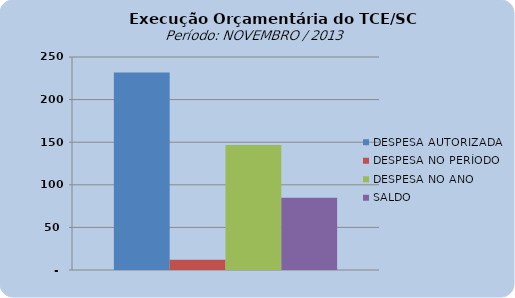
| Category | DESPESA AUTORIZADA | DESPESA NO PERÍODO | DESPESA NO ANO | SALDO |
|---|---|---|---|---|
| 0 | 231749907.56 | 12049300.44 | 146826697.98 | 84923209.58 |